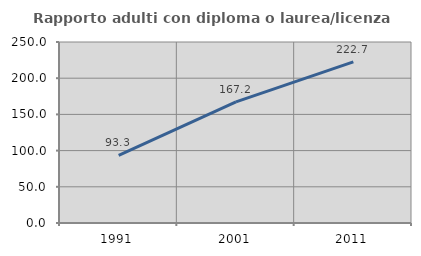
| Category | Rapporto adulti con diploma o laurea/licenza media  |
|---|---|
| 1991.0 | 93.251 |
| 2001.0 | 167.203 |
| 2011.0 | 222.656 |